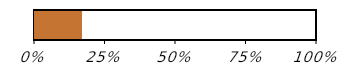
| Category | Πρόοδος αγορών (1 από 6) |
|---|---|
| Αγορασμένα | 0.167 |